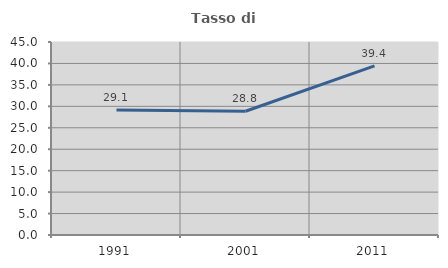
| Category | Tasso di occupazione   |
|---|---|
| 1991.0 | 29.12 |
| 2001.0 | 28.846 |
| 2011.0 | 39.446 |